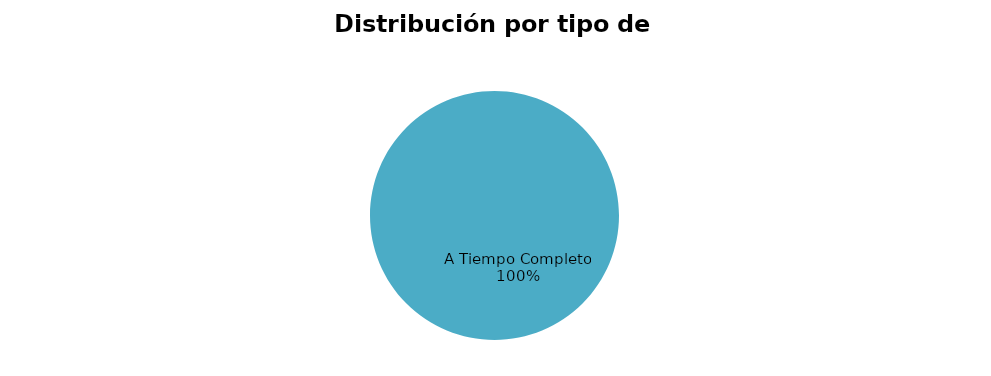
| Category | 8 |
|---|---|
| A Tiempo Completo | 8 |